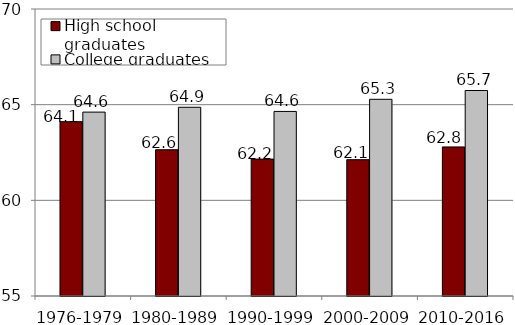
| Category | High school graduates | College graduates |
|---|---|---|
| 1976-1979 | 64.111 | 64.611 |
| 1980-1989 | 62.645 | 64.864 |
| 1990-1999 | 62.155 | 64.647 |
| 2000-2009 | 62.124 | 65.281 |
| 2010-2016 | 62.79 | 65.741 |